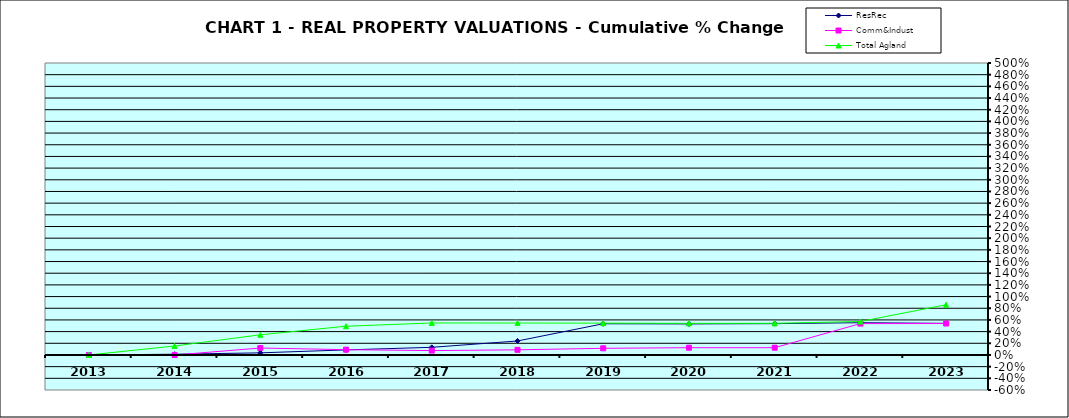
| Category | ResRec | Comm&Indust | Total Agland |
|---|---|---|---|
| 2013.0 | 0 | 0 | 0 |
| 2014.0 | 0.013 | -0.001 | 0.154 |
| 2015.0 | 0.036 | 0.119 | 0.346 |
| 2016.0 | 0.087 | 0.09 | 0.492 |
| 2017.0 | 0.131 | 0.075 | 0.548 |
| 2018.0 | 0.24 | 0.088 | 0.547 |
| 2019.0 | 0.534 | 0.114 | 0.545 |
| 2020.0 | 0.532 | 0.124 | 0.542 |
| 2021.0 | 0.536 | 0.124 | 0.542 |
| 2022.0 | 0.553 | 0.537 | 0.573 |
| 2023.0 | 0.541 | 0.539 | 0.86 |